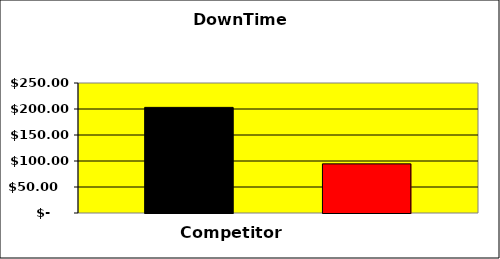
| Category | Series 0 | Series 1 | Series 2 |
|---|---|---|---|
| 0 | 203.125 |  | 94.477 |